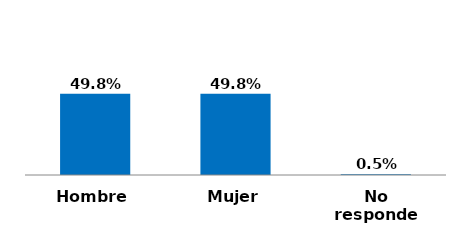
| Category | Series 0 |
|---|---|
| Hombre | 0.498 |
| Mujer | 0.498 |
| No responde | 0.005 |